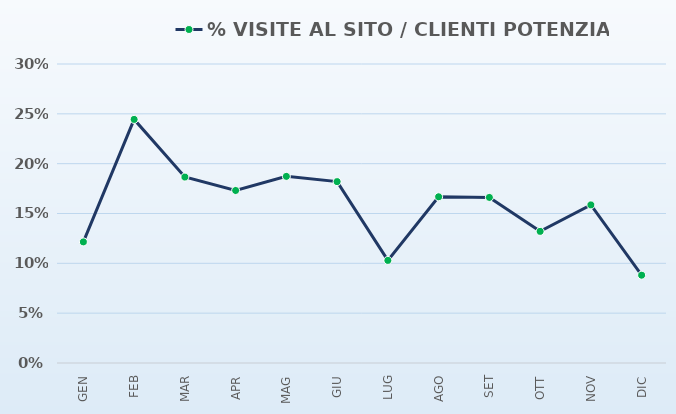
| Category | TASSI DI CONVERSIONE | % VISITE AL SITO / CLIENTI POTENZIALI |
|---|---|---|
| GEN |  | 0.122 |
| FEB |  | 0.244 |
| MAR |  | 0.187 |
| APR |  | 0.173 |
| MAG |  | 0.187 |
| GIU |  | 0.182 |
| LUG |  | 0.103 |
| AGO |  | 0.167 |
| SET |  | 0.166 |
| OTT |  | 0.132 |
| NOV |  | 0.159 |
| DIC |  | 0.088 |